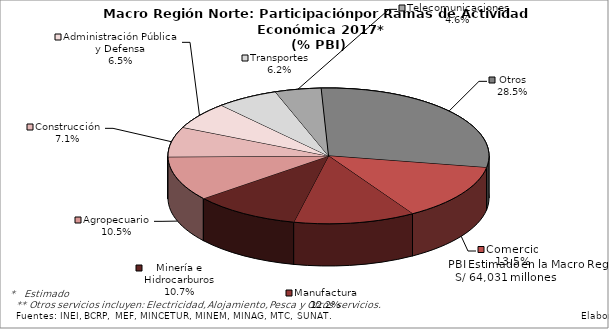
| Category | Series 0 |
|---|---|
| Comercio | 8615.011 |
| Manufactura | 7840.909 |
| Minería e Hidrocarburos | 6881.255 |
| Agropecuario | 6755.3 |
| Construcción | 4568.928 |
| Administración Pública y Defensa | 4140.956 |
| Transportes | 3998.211 |
| Telecomunicaciones | 2976.25 |
| Otros | 18254.674 |